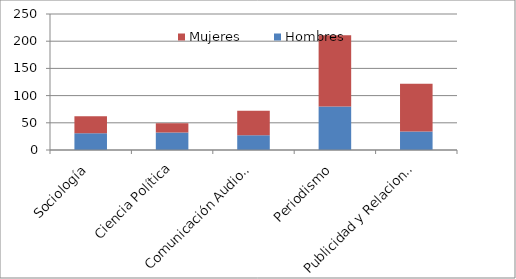
| Category | Hombres | Mujeres |
|---|---|---|
| Sociología | 31 | 31 |
| Ciencia Política | 32 | 17 |
| Comunicación Audiovisual | 27 | 45 |
| Periodismo | 80 | 131 |
| Publicidad y Relaciones Públicas | 34 | 88 |